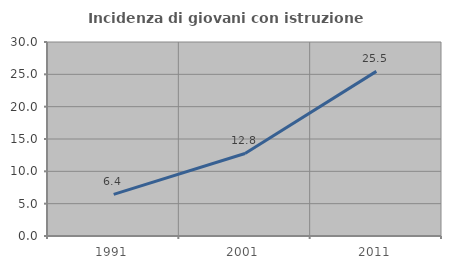
| Category | Incidenza di giovani con istruzione universitaria |
|---|---|
| 1991.0 | 6.428 |
| 2001.0 | 12.764 |
| 2011.0 | 25.455 |